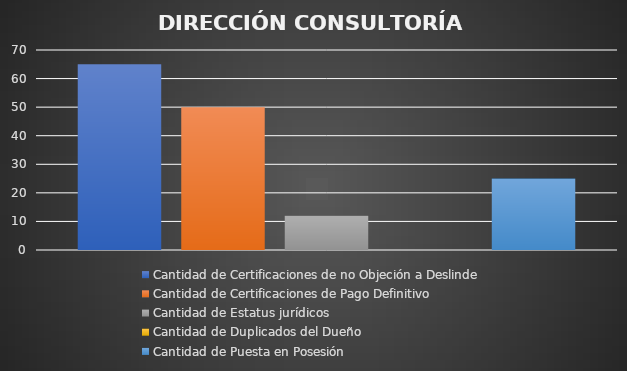
| Category | Cantidad de Certificaciones de no Objeción a Deslinde | Cantidad de Certificaciones de Pago Definitivo  | Cantidad de Estatus jurídicos | Cantidad de Duplicados del Dueño | Cantidad de Puesta en Posesión  |
|---|---|---|---|---|---|
| 0 | 65 | 50 | 12 | 0 | 25 |